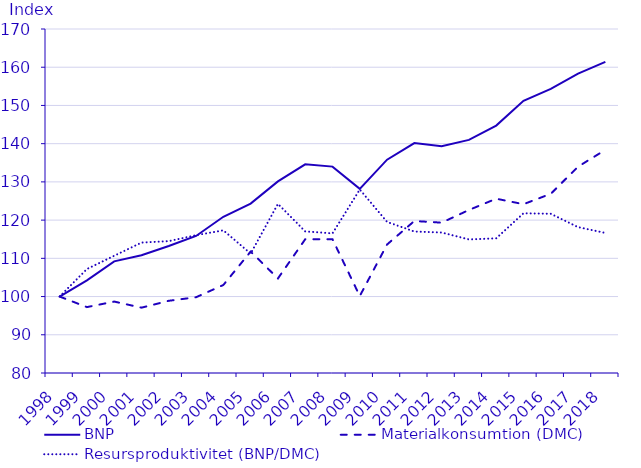
| Category | BNP | Materialkonsumtion (DMC) | Resursproduktivitet (BNP/DMC) |
|---|---|---|---|
| 1998.0 | 100 | 100 | 100 |
| 1999.0 | 104.247 | 97.241 | 107.205 |
| 2000.0 | 109.216 | 98.687 | 110.669 |
| 2001.0 | 110.799 | 97.091 | 114.118 |
| 2002.0 | 113.233 | 98.892 | 114.502 |
| 2003.0 | 115.849 | 99.823 | 116.054 |
| 2004.0 | 120.873 | 103.025 | 117.324 |
| 2005.0 | 124.328 | 111.765 | 111.24 |
| 2006.0 | 130.126 | 104.734 | 124.243 |
| 2007.0 | 134.601 | 114.994 | 117.051 |
| 2008.0 | 133.994 | 114.987 | 116.53 |
| 2009.0 | 128.179 | 100.135 | 128.006 |
| 2010.0 | 135.809 | 113.619 | 119.529 |
| 2011.0 | 140.148 | 119.768 | 117.016 |
| 2012.0 | 139.324 | 119.331 | 116.754 |
| 2013.0 | 140.979 | 122.65 | 114.944 |
| 2014.0 | 144.726 | 125.596 | 115.231 |
| 2015.0 | 151.223 | 124.168 | 121.788 |
| 2016.0 | 154.354 | 126.883 | 121.65 |
| 2017.0 | 158.318 | 133.983 | 118.162 |
| 2018.0 | 161.405 | 138.379 | 116.64 |